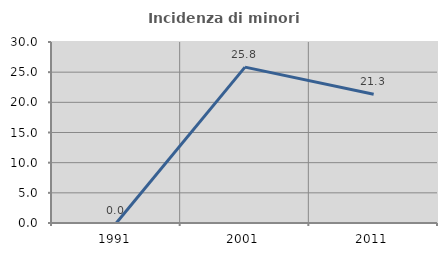
| Category | Incidenza di minori stranieri |
|---|---|
| 1991.0 | 0 |
| 2001.0 | 25.833 |
| 2011.0 | 21.341 |